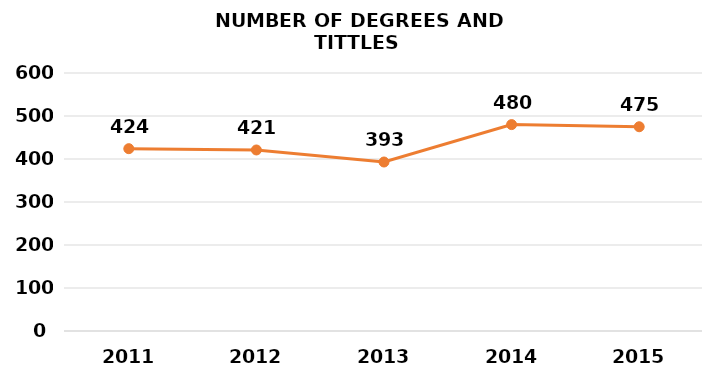
| Category | Series 1 |
|---|---|
| 2011.0 | 424 |
| 2012.0 | 421 |
| 2013.0 | 393 |
| 2014.0 | 480 |
| 2015.0 | 475 |